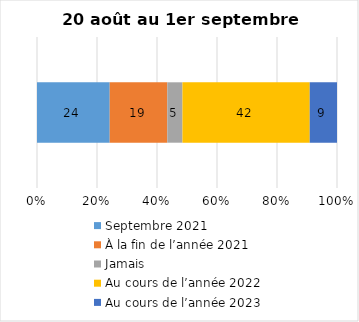
| Category | Septembre 2021 | À la fin de l’année 2021 | Jamais | Au cours de l’année 2022 | Au cours de l’année 2023 |
|---|---|---|---|---|---|
| 0 | 24 | 19 | 5 | 42 | 9 |